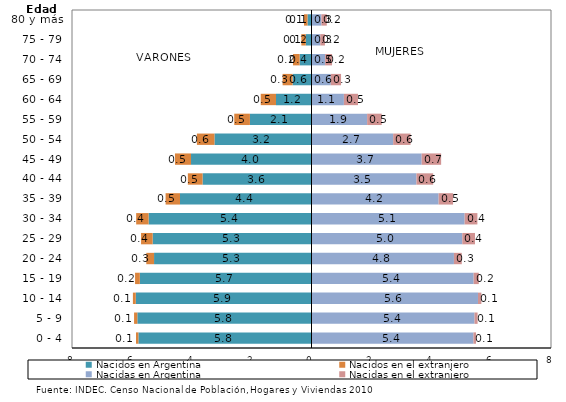
| Category | Nacido en Argentina | Nacido en el extranjero | Nacida en Argentina | Nacida en el extranjero | Nacidos en Argentina | Nacidos en el extranjero | Nacidas en Argentina | Nacidas en el extranjero |
|---|---|---|---|---|---|---|---|---|
| 0 - 4 |  |  |  |  | -5.783 | -0.08 | 5.41 | 0.085 |
| 5 - 9 |  |  |  |  | -5.818 | -0.109 | 5.445 | 0.103 |
| 10 - 14 |  |  |  |  | -5.87 | -0.096 | 5.561 | 0.113 |
| 15 - 19 |  |  |  |  | -5.734 | -0.159 | 5.416 | 0.172 |
| 20 - 24 |  |  |  |  | -5.259 | -0.259 | 4.758 | 0.261 |
| 25 - 29 |  |  |  |  | -5.306 | -0.388 | 5.037 | 0.425 |
| 30 - 34 |  |  |  |  | -5.441 | -0.416 | 5.115 | 0.426 |
| 35 - 39 |  |  |  |  | -4.393 | -0.481 | 4.246 | 0.483 |
| 40 - 44 |  |  |  |  | -3.639 | -0.492 | 3.505 | 0.559 |
| 45 - 49 |  |  |  |  | -4.025 | -0.536 | 3.679 | 0.651 |
| 50 - 54 |  |  |  |  | -3.242 | -0.586 | 2.728 | 0.581 |
| 55 - 59 |  |  |  |  | -2.057 | -0.523 | 1.858 | 0.488 |
| 60 - 64 |  |  |  |  | -1.186 | -0.51 | 1.082 | 0.47 |
| 65 - 69 |  |  |  |  | -0.632 | -0.333 | 0.643 | 0.344 |
| 70 - 74 |  |  |  |  | -0.397 | -0.221 | 0.455 | 0.232 |
| 75 - 79 |  |  |  |  | -0.191 | -0.148 | 0.294 | 0.154 |
| 80 y más |  |  |  |  | -0.134 | -0.117 | 0.332 | 0.178 |